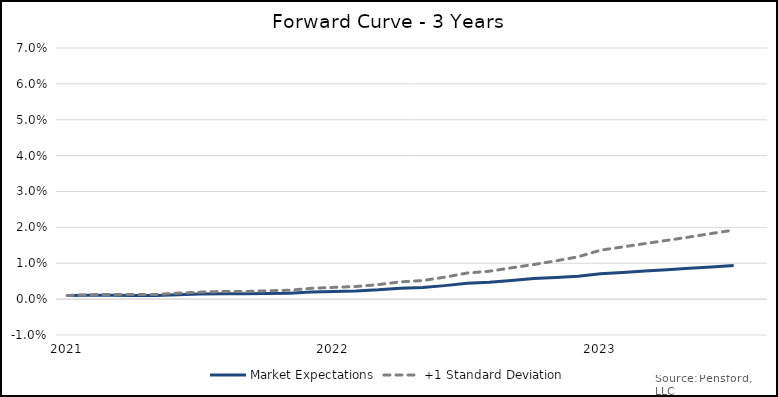
| Category | Market Expectations | +1 Standard Deviation |
|---|---|---|
| 2021-06-30 | 0.001 | 0.001 |
| 2021-07-30 | 0.001 | 0.001 |
| 2021-08-30 | 0.001 | 0.001 |
| 2021-09-30 | 0.001 | 0.001 |
| 2021-10-30 | 0.001 | 0.001 |
| 2021-11-30 | 0.001 | 0.002 |
| 2021-12-30 | 0.001 | 0.002 |
| 2022-01-30 | 0.002 | 0.002 |
| 2022-02-28 | 0.001 | 0.002 |
| 2022-03-28 | 0.002 | 0.002 |
| 2022-04-28 | 0.002 | 0.002 |
| 2022-05-28 | 0.002 | 0.003 |
| 2022-06-28 | 0.002 | 0.003 |
| 2022-07-28 | 0.002 | 0.004 |
| 2022-08-28 | 0.003 | 0.004 |
| 2022-09-28 | 0.003 | 0.005 |
| 2022-10-28 | 0.003 | 0.005 |
| 2022-11-28 | 0.004 | 0.006 |
| 2022-12-28 | 0.004 | 0.007 |
| 2023-01-28 | 0.005 | 0.008 |
| 2023-02-28 | 0.005 | 0.009 |
| 2023-03-28 | 0.006 | 0.01 |
| 2023-04-28 | 0.006 | 0.011 |
| 2023-05-28 | 0.006 | 0.012 |
| 2023-06-28 | 0.007 | 0.014 |
| 2023-07-28 | 0.007 | 0.015 |
| 2023-08-28 | 0.008 | 0.015 |
| 2023-09-28 | 0.008 | 0.016 |
| 2023-10-28 | 0.009 | 0.017 |
| 2023-11-28 | 0.009 | 0.018 |
| 2023-12-28 | 0.009 | 0.019 |
| 2024-01-28 | 0.01 | 0.02 |
| 2024-02-28 | 0.01 | 0.021 |
| 2024-03-28 | 0.01 | 0.022 |
| 2024-04-28 | 0.011 | 0.023 |
| 2024-05-28 | 0.011 | 0.025 |
| 2024-06-28 | 0.011 | 0.025 |
| 2024-07-28 | 0.011 | 0.026 |
| 2024-08-28 | 0.012 | 0.027 |
| 2024-09-28 | 0.012 | 0.028 |
| 2024-10-28 | 0.012 | 0.029 |
| 2024-11-28 | 0.013 | 0.03 |
| 2024-12-28 | 0.013 | 0.031 |
| 2025-01-28 | 0.013 | 0.032 |
| 2025-02-28 | 0.014 | 0.033 |
| 2025-03-28 | 0.014 | 0.034 |
| 2025-04-28 | 0.014 | 0.035 |
| 2025-05-28 | 0.015 | 0.036 |
| 2025-06-28 | 0.013 | 0.034 |
| 2025-07-28 | 0.014 | 0.035 |
| 2025-08-28 | 0.014 | 0.035 |
| 2025-09-28 | 0.014 | 0.036 |
| 2025-10-28 | 0.014 | 0.037 |
| 2025-11-28 | 0.015 | 0.038 |
| 2025-12-28 | 0.015 | 0.039 |
| 2026-01-28 | 0.015 | 0.04 |
| 2026-02-28 | 0.015 | 0.041 |
| 2026-03-28 | 0.016 | 0.042 |
| 2026-04-28 | 0.016 | 0.043 |
| 2026-05-28 | 0.016 | 0.044 |
| 2026-06-28 | 0.015 | 0.041 |
| 2026-07-28 | 0.015 | 0.042 |
| 2026-08-28 | 0.016 | 0.043 |
| 2026-09-28 | 0.016 | 0.044 |
| 2026-10-28 | 0.016 | 0.044 |
| 2026-11-28 | 0.016 | 0.045 |
| 2026-12-28 | 0.017 | 0.046 |
| 2027-01-28 | 0.017 | 0.047 |
| 2027-02-28 | 0.017 | 0.048 |
| 2027-03-28 | 0.017 | 0.049 |
| 2027-04-28 | 0.017 | 0.05 |
| 2027-05-28 | 0.018 | 0.05 |
| 2027-06-28 | 0.016 | 0.047 |
| 2027-07-28 | 0.016 | 0.048 |
| 2027-08-28 | 0.017 | 0.048 |
| 2027-09-28 | 0.017 | 0.049 |
| 2027-10-28 | 0.017 | 0.05 |
| 2027-11-28 | 0.017 | 0.051 |
| 2027-12-28 | 0.017 | 0.051 |
| 2028-01-28 | 0.017 | 0.052 |
| 2028-02-28 | 0.018 | 0.053 |
| 2028-03-28 | 0.018 | 0.054 |
| 2028-04-28 | 0.018 | 0.054 |
| 2028-05-28 | 0.018 | 0.054 |
| 2028-06-28 | 0.017 | 0.051 |
| 2028-07-28 | 0.017 | 0.052 |
| 2028-08-28 | 0.017 | 0.052 |
| 2028-09-28 | 0.017 | 0.053 |
| 2028-10-28 | 0.018 | 0.053 |
| 2028-11-28 | 0.018 | 0.054 |
| 2028-12-28 | 0.018 | 0.055 |
| 2029-01-28 | 0.018 | 0.055 |
| 2029-02-28 | 0.018 | 0.056 |
| 2029-03-28 | 0.018 | 0.057 |
| 2029-04-28 | 0.018 | 0.057 |
| 2029-05-28 | 0.018 | 0.057 |
| 2029-06-28 | 0.017 | 0.055 |
| 2029-07-28 | 0.018 | 0.055 |
| 2029-08-28 | 0.018 | 0.056 |
| 2029-09-28 | 0.018 | 0.057 |
| 2029-10-28 | 0.018 | 0.057 |
| 2029-11-28 | 0.018 | 0.058 |
| 2029-12-28 | 0.018 | 0.058 |
| 2030-01-28 | 0.018 | 0.059 |
| 2030-02-28 | 0.018 | 0.059 |
| 2030-03-28 | 0.018 | 0.06 |
| 2030-04-28 | 0.019 | 0.06 |
| 2030-05-28 | 0.019 | 0.061 |
| 2030-06-28 | 0.018 | 0.059 |
| 2030-07-28 | 0.018 | 0.059 |
| 2030-08-28 | 0.018 | 0.06 |
| 2030-09-28 | 0.018 | 0.06 |
| 2030-10-28 | 0.018 | 0.061 |
| 2030-11-28 | 0.018 | 0.061 |
| 2030-12-28 | 0.019 | 0.062 |
| 2031-01-28 | 0.019 | 0.062 |
| 2031-02-28 | 0.019 | 0.063 |
| 2031-03-28 | 0.019 | 0.063 |
| 2031-04-28 | 0.019 | 0.064 |
| 2031-05-28 | 0.019 | 0.064 |